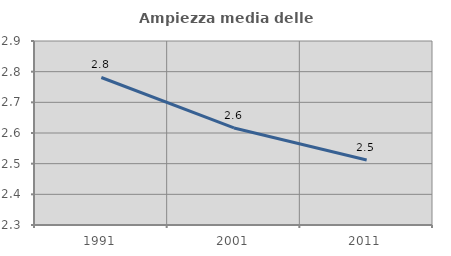
| Category | Ampiezza media delle famiglie |
|---|---|
| 1991.0 | 2.781 |
| 2001.0 | 2.617 |
| 2011.0 | 2.512 |